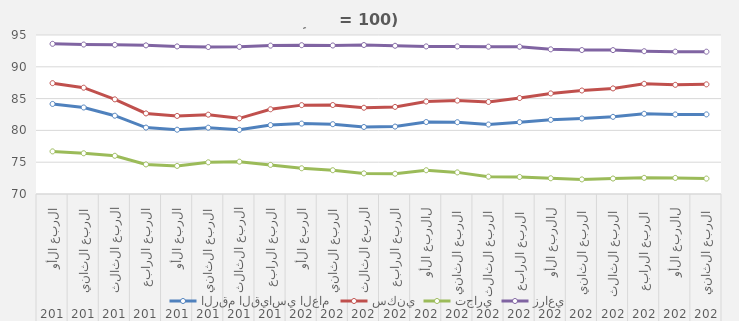
| Category | الرقم القياسي العام | سكني | تجاري | زراعي |
|---|---|---|---|---|
| 0 | 84.16 | 87.43 | 76.7 | 93.61 |
| 1 | 83.603 | 86.713 | 76.403 | 93.5 |
| 2 | 82.31 | 84.883 | 76.01 | 93.45 |
| 3 | 80.443 | 82.67 | 74.65 | 93.37 |
| 4 | 80.11 | 82.277 | 74.417 | 93.203 |
| 5 | 80.427 | 82.473 | 74.983 | 93.11 |
| 6 | 80.093 | 81.9 | 75.083 | 93.14 |
| 7 | 80.833 | 83.32 | 74.577 | 93.33 |
| 8 | 81.07 | 83.973 | 74.047 | 93.397 |
| 9 | 80.977 | 83.99 | 73.74 | 93.353 |
| 10 | 80.538 | 83.562 | 73.242 | 93.424 |
| 11 | 80.6 | 83.696 | 73.187 | 93.307 |
| 12 | 81.315 | 84.54 | 73.736 | 93.206 |
| 13 | 81.291 | 84.687 | 73.398 | 93.204 |
| 14 | 80.925 | 84.473 | 72.728 | 93.164 |
| 15 | 81.295 | 85.089 | 72.682 | 93.157 |
| 16 | 81.662 | 85.816 | 72.474 | 92.745 |
| 17 | 81.879 | 86.272 | 72.295 | 92.633 |
| 18 | 82.132 | 86.603 | 72.433 | 92.625 |
| 19 | 82.616 | 87.33 | 72.541 | 92.453 |
| 20 | 82.506 | 87.165 | 72.527 | 92.384 |
| 21 | 82.516 | 87.24 | 72.425 | 92.376 |